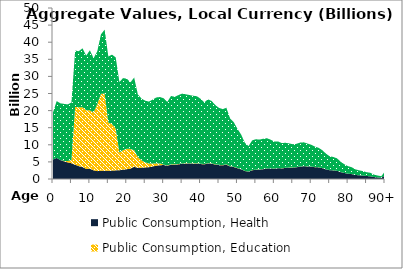
| Category | Public Consumption, Health | Public Consumption, Education | Public Consumption, Other than health and education |
|---|---|---|---|
| 0 | 5713.731 | 0 | 13763.425 |
|  | 6143.341 | 0 | 16635.999 |
| 2 | 5543.784 | 0 | 16589.627 |
| 3 | 5160.463 | 134.087 | 16666.056 |
| 4 | 4856.354 | 398.181 | 16552.004 |
| 5 | 4603.273 | 965.854 | 16771.72 |
| 6 | 4171.006 | 16913.976 | 16474.184 |
| 7 | 3752.566 | 17235.113 | 16388.696 |
| 8 | 3513.972 | 17467.891 | 17233.232 |
| 9 | 2945.777 | 17158.912 | 15983.644 |
| 10 | 3004.78 | 17072.216 | 17552.384 |
| 11 | 2534.009 | 16907.083 | 15889.664 |
| 12 | 2297.772 | 19579.948 | 15459.702 |
| 13 | 2390.998 | 22545.156 | 17371.989 |
| 14 | 2400.738 | 22579.778 | 18686.941 |
| 15 | 2377.936 | 14159.674 | 19280.571 |
| 16 | 2463.103 | 13583.578 | 20320.839 |
| 17 | 2523.911 | 12191.525 | 20841.23 |
| 18 | 2547.744 | 5240.006 | 20585.949 |
| 19 | 2736.375 | 5706.408 | 21057.806 |
| 20 | 2868.883 | 5998.953 | 20446.163 |
| 21 | 3024.687 | 5768.378 | 19471.825 |
| 22 | 3569.106 | 4865.948 | 21219.724 |
| 23 | 3251.866 | 3179.592 | 18316.733 |
| 24 | 3310.335 | 2138.577 | 18058.673 |
| 25 | 3384.599 | 1456.266 | 18051.313 |
| 26 | 3457.035 | 1105.941 | 18079.26 |
| 27 | 3666.815 | 852.369 | 18694.661 |
| 28 | 3877.409 | 692.098 | 19266.983 |
| 29 | 4030.425 | 536.491 | 19401.366 |
| 30 | 4086.093 | 107.177 | 19405.38 |
| 31 | 3886.196 | 102.573 | 18571.91 |
| 32 | 4192.749 | 110.341 | 19978.372 |
| 33 | 4171.096 | 109.081 | 19750.215 |
| 34 | 4292.415 | 111.136 | 20122.224 |
| 35 | 4433.992 | 112.839 | 20430.619 |
| 36 | 4485.85 | 111.393 | 20168.751 |
| 37 | 4514.405 | 110.038 | 19923.404 |
| 38 | 4491.672 | 109.032 | 19741.208 |
| 39 | 4497.536 | 108.224 | 19594.936 |
| 40 | 4370.236 | 104.83 | 18980.513 |
| 41 | 4276.891 | 99.572 | 18028.41 |
| 42 | 4538.753 | 103.02 | 18652.766 |
| 43 | 4472.082 | 100.761 | 18243.803 |
| 44 | 4230.813 | 95.485 | 17288.457 |
| 45 | 4051.464 | 91.976 | 16653.138 |
| 46 | 4006.066 | 90.163 | 16324.825 |
| 47 | 4187.068 | 91.404 | 16549.482 |
| 48 | 3668.851 | 77.202 | 13978.097 |
| 49 | 3502.115 | 71.999 | 13036.184 |
| 50 | 3146.16 | 63.353 | 11470.687 |
| 51 | 2822.753 | 55.855 | 10113.017 |
| 52 | 2341.736 | 45.543 | 8245.97 |
| 53 | 2134.991 | 41.019 | 7426.911 |
| 54 | 2552.819 | 48.032 | 8696.674 |
| 55 | 2688.385 | 49.102 | 8890.348 |
| 56 | 2733.068 | 48.282 | 8741.966 |
| 57 | 2882.257 | 48.866 | 8847.732 |
| 58 | 3031.445 | 48.777 | 8831.52 |
| 59 | 3050.943 | 46.463 | 8412.623 |
| 60 | 3017.843 | 43.646 | 7902.474 |
| 61 | 3131.292 | 43.11 | 7805.406 |
| 62 | 3096.381 | 40.692 | 7367.672 |
| 63 | 3235.728 | 40.386 | 7312.292 |
| 64 | 3299.227 | 39.055 | 7071.32 |
| 65 | 3319.138 | 37.65 | 6816.914 |
| 66 | 3429.913 | 37.657 | 6818.201 |
| 67 | 3617.254 | 38.565 | 6982.641 |
| 68 | 3718.715 | 38.475 | 6966.274 |
| 69 | 3666.631 | 36.74 | 6652.114 |
| 70 | 3599.436 | 35.278 | 6387.415 |
| 71 | 3459.468 | 33.053 | 5984.525 |
| 72 | 3387.953 | 31.489 | 5701.401 |
| 73 | 3167.967 | 28.897 | 5232.014 |
| 74 | 2831.386 | 25.155 | 4554.594 |
| 75 | 2564.509 | 22.423 | 4059.886 |
| 76 | 2513.031 | 21.522 | 3896.784 |
| 77 | 2387.698 | 20.012 | 3623.387 |
| 78 | 2015.581 | 16.52 | 2991.105 |
| 79 | 1742.516 | 13.994 | 2533.761 |
| 80 | 1543.596 | 12.17 | 2203.544 |
| 81 | 1419.644 | 11 | 1991.651 |
| 82 | 1182.264 | 8.976 | 1625.2 |
| 83 | 1075.897 | 7.994 | 1447.378 |
| 84 | 995.922 | 7.236 | 1310.114 |
| 85 | 867.186 | 6.161 | 1115.514 |
| 86 | 808.099 | 5.617 | 1017.004 |
| 87 | 567.916 | 3.865 | 699.808 |
| 88 | 460.427 | 3.071 | 555.956 |
| 89 | 367.423 | 2.403 | 435.006 |
| 90+ | 1037.328 | 6.651 | 1204.141 |